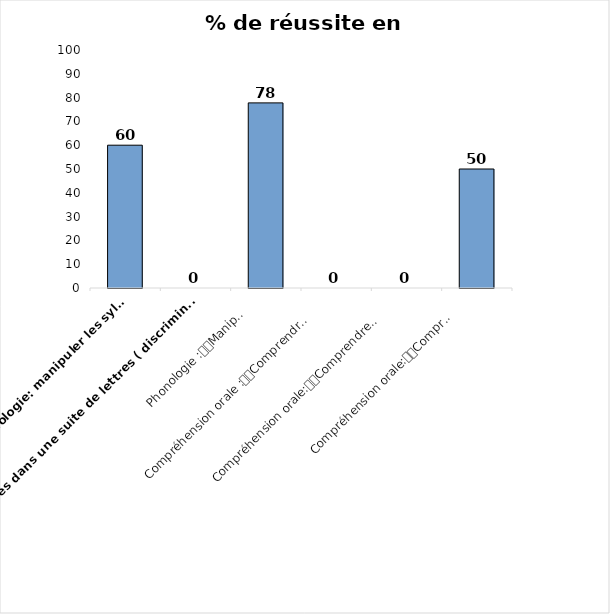
| Category | Series 0 |
|---|---|
| Phonologie: manipuler les syllabes | 60 |
| Reconnaitre des lettres dans une suite de lettres ( discrimination visuelle) | 0 |
| Phonologie :
Manipuler les phonèmes | 77.778 |
| Compréhension orale :
Comprendre des phrases lues par l'adulte | 0 |
| Compréhension orale:
Comprendre des mots donnés par l'adulte | 0 |
| Compréhension orale:
Comprendre un texte lu par l'adulte | 50 |